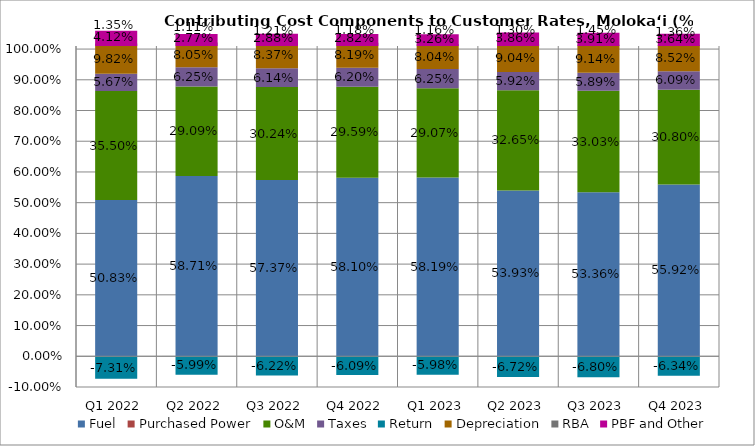
| Category | Fuel | Purchased Power | O&M | Taxes | Return | Depreciation | RBA | PBF and Other |
|---|---|---|---|---|---|---|---|---|
| Q1 2022 | 0.508 | 0 | 0.355 | 0.057 | -0.073 | 0.098 | 0.041 | 0.013 |
| Q2 2022 | 0.587 | 0 | 0.291 | 0.062 | -0.06 | 0.081 | 0.028 | 0.011 |
| Q3 2022 | 0.574 | 0 | 0.302 | 0.061 | -0.062 | 0.084 | 0.029 | 0.012 |
| Q4 2022 | 0.581 | 0 | 0.296 | 0.062 | -0.061 | 0.082 | 0.028 | 0.012 |
| Q1 2023 | 0.582 | 0 | 0.291 | 0.062 | -0.06 | 0.08 | 0.033 | 0.012 |
| Q2 2023 | 0.539 | 0 | 0.326 | 0.059 | -0.067 | 0.09 | 0.039 | 0.013 |
| Q3 2023 | 0.534 | 0 | 0.33 | 0.059 | -0.068 | 0.091 | 0.039 | 0.015 |
| Q4 2023 | 0.559 | 0 | 0.308 | 0.061 | -0.063 | 0.085 | 0.036 | 0.014 |